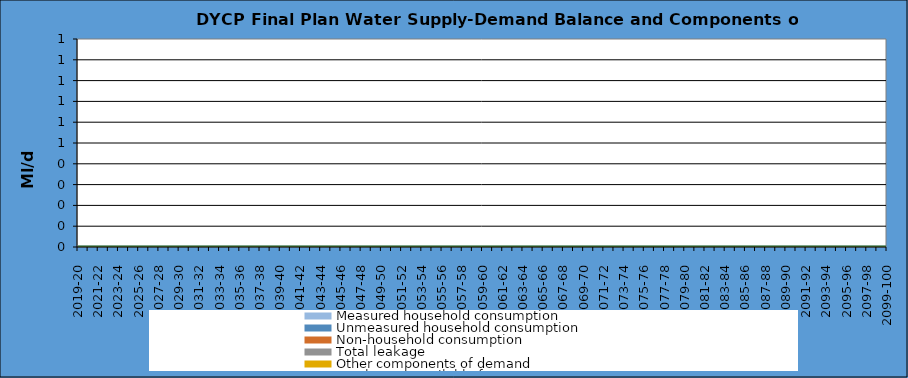
| Category | Total water available for use | Total demand + target headroom (final plan) |
|---|---|---|
| 0 | 0 | 0 |
| 1 | 0 | 0 |
| 2 | 0 | 0 |
| 3 | 0 | 0 |
| 4 | 0 | 0 |
| 5 | 0 | 0 |
| 6 | 0 | 0 |
| 7 | 0 | 0 |
| 8 | 0 | 0 |
| 9 | 0 | 0 |
| 10 | 0 | 0 |
| 11 | 0 | 0 |
| 12 | 0 | 0 |
| 13 | 0 | 0 |
| 14 | 0 | 0 |
| 15 | 0 | 0 |
| 16 | 0 | 0 |
| 17 | 0 | 0 |
| 18 | 0 | 0 |
| 19 | 0 | 0 |
| 20 | 0 | 0 |
| 21 | 0 | 0 |
| 22 | 0 | 0 |
| 23 | 0 | 0 |
| 24 | 0 | 0 |
| 25 | 0 | 0 |
| 26 | 0 | 0 |
| 27 | 0 | 0 |
| 28 | 0 | 0 |
| 29 | 0 | 0 |
| 30 | 0 | 0 |
| 31 | 0 | 0 |
| 32 | 0 | 0 |
| 33 | 0 | 0 |
| 34 | 0 | 0 |
| 35 | 0 | 0 |
| 36 | 0 | 0 |
| 37 | 0 | 0 |
| 38 | 0 | 0 |
| 39 | 0 | 0 |
| 40 | 0 | 0 |
| 41 | 0 | 0 |
| 42 | 0 | 0 |
| 43 | 0 | 0 |
| 44 | 0 | 0 |
| 45 | 0 | 0 |
| 46 | 0 | 0 |
| 47 | 0 | 0 |
| 48 | 0 | 0 |
| 49 | 0 | 0 |
| 50 | 0 | 0 |
| 51 | 0 | 0 |
| 52 | 0 | 0 |
| 53 | 0 | 0 |
| 54 | 0 | 0 |
| 55 | 0 | 0 |
| 56 | 0 | 0 |
| 57 | 0 | 0 |
| 58 | 0 | 0 |
| 59 | 0 | 0 |
| 60 | 0 | 0 |
| 61 | 0 | 0 |
| 62 | 0 | 0 |
| 63 | 0 | 0 |
| 64 | 0 | 0 |
| 65 | 0 | 0 |
| 66 | 0 | 0 |
| 67 | 0 | 0 |
| 68 | 0 | 0 |
| 69 | 0 | 0 |
| 70 | 0 | 0 |
| 71 | 0 | 0 |
| 72 | 0 | 0 |
| 73 | 0 | 0 |
| 74 | 0 | 0 |
| 75 | 0 | 0 |
| 76 | 0 | 0 |
| 77 | 0 | 0 |
| 78 | 0 | 0 |
| 79 | 0 | 0 |
| 80 | 0 | 0 |